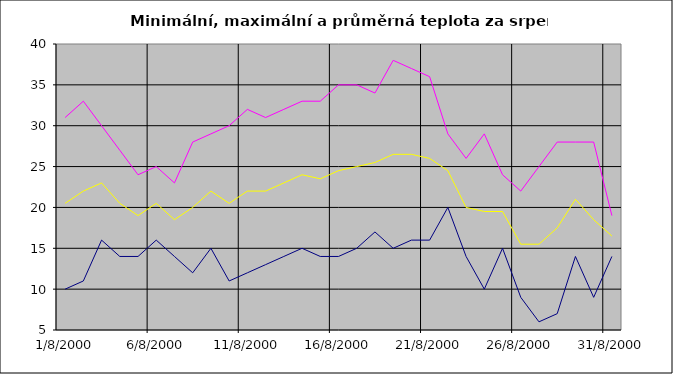
| Category | Series 0 | Series 1 | Series 2 |
|---|---|---|---|
| 2000-08-01 | 10 | 31 | 20.5 |
| 2000-08-02 | 11 | 33 | 22 |
| 2000-08-03 | 16 | 30 | 23 |
| 2000-08-04 | 14 | 27 | 20.5 |
| 2000-08-05 | 14 | 24 | 19 |
| 2000-08-06 | 16 | 25 | 20.5 |
| 2000-08-07 | 14 | 23 | 18.5 |
| 2000-08-08 | 12 | 28 | 20 |
| 2000-08-09 | 15 | 29 | 22 |
| 2000-08-10 | 11 | 30 | 20.5 |
| 2000-08-11 | 12 | 32 | 22 |
| 2000-08-12 | 13 | 31 | 22 |
| 2000-08-13 | 14 | 32 | 23 |
| 2000-08-14 | 15 | 33 | 24 |
| 2000-08-15 | 14 | 33 | 23.5 |
| 2000-08-16 | 14 | 35 | 24.5 |
| 2000-08-17 | 15 | 35 | 25 |
| 2000-08-18 | 17 | 34 | 25.5 |
| 2000-08-19 | 15 | 38 | 26.5 |
| 2000-08-20 | 16 | 37 | 26.5 |
| 2000-08-21 | 16 | 36 | 26 |
| 2000-08-22 | 20 | 29 | 24.5 |
| 2000-08-23 | 14 | 26 | 20 |
| 2000-08-24 | 10 | 29 | 19.5 |
| 2000-08-25 | 15 | 24 | 19.5 |
| 2000-08-26 | 9 | 22 | 15.5 |
| 2000-08-27 | 6 | 25 | 15.5 |
| 2000-08-28 | 7 | 28 | 17.5 |
| 2000-08-29 | 14 | 28 | 21 |
| 2000-08-30 | 9 | 28 | 18.5 |
| 2000-08-31 | 14 | 19 | 16.5 |